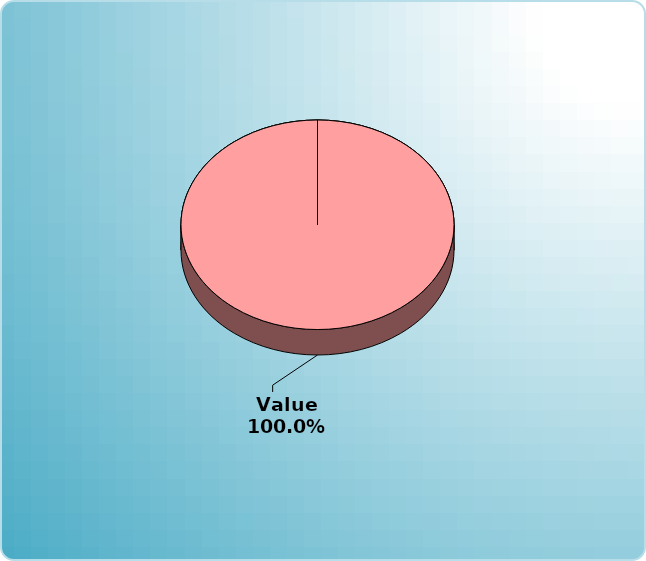
| Category | Series 0 |
|---|---|
| Cash | 0 |
| Bonds | 0 |
| Muni Bond | 0 |
| Hybrid bond | 0 |
| Value | 4000 |
| Growth | 0 |
| Small-Cap | 0 |
| Tangibles | 0 |
| International | 0 |
| Personal Property | 0 |
| Miscellaneous | 0 |